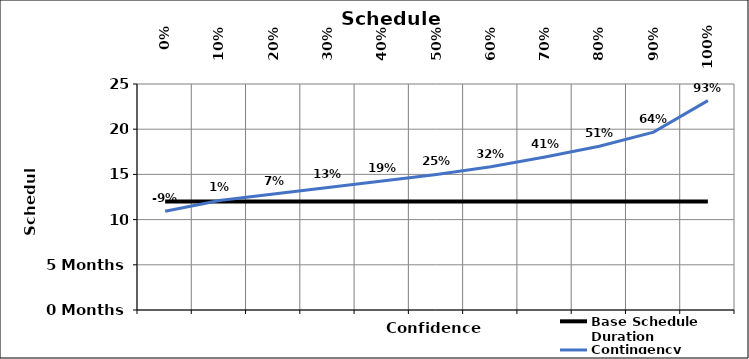
| Category | Base Schedule Duration | Contingency |
|---|---|---|
| 0.0 | 12 | 10.92 |
| 0.1 | 12 | 12.12 |
| 0.2 | 12 | 12.84 |
| 0.3 | 12 | 13.56 |
| 0.4 | 12 | 14.28 |
| 0.5 | 12 | 15 |
| 0.6 | 12 | 15.84 |
| 0.7 | 12 | 16.92 |
| 0.8 | 12 | 18.12 |
| 0.9 | 12 | 19.68 |
| 1.0 | 12 | 23.16 |